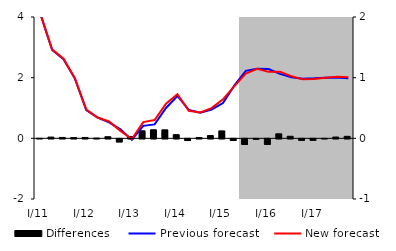
| Category | Differences |
|---|---|
| I/11 | 0.001 |
| II | 0.02 |
| III | 0.015 |
| IV | 0.012 |
| I/12 | 0.014 |
| II | 0.005 |
| III | 0.027 |
| IV | -0.051 |
| I/13 | 0.029 |
| II | 0.124 |
| III | 0.141 |
| IV | 0.14 |
| I/14 | 0.061 |
| II | -0.028 |
| III | 0.013 |
| IV | 0.045 |
| I/15 | 0.123 |
| II | -0.027 |
| III | -0.092 |
| IV | -0.006 |
| I/16 | -0.092 |
| II | 0.075 |
| III | 0.034 |
| IV | -0.024 |
| I/17 | -0.023 |
| II | 0 |
| III | 0.021 |
| IV | 0.033 |